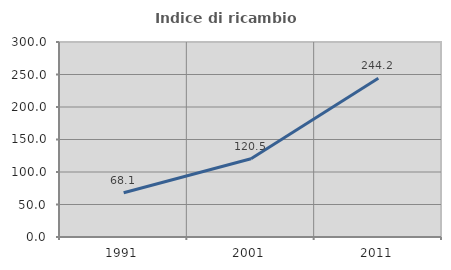
| Category | Indice di ricambio occupazionale  |
|---|---|
| 1991.0 | 68.145 |
| 2001.0 | 120.475 |
| 2011.0 | 244.151 |